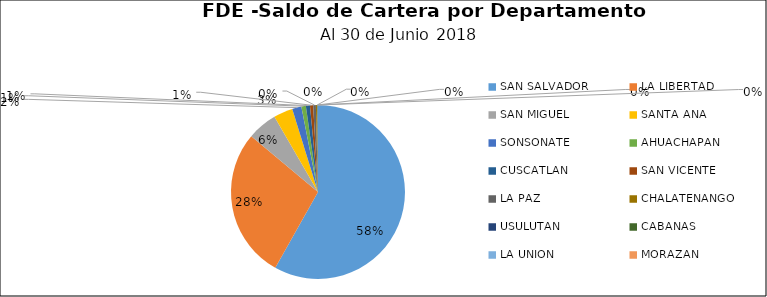
| Category | Saldo | Créditos |
|---|---|---|
| SAN SALVADOR | 29.787 | 396 |
| LA LIBERTAD | 14.299 | 139 |
| SAN MIGUEL | 2.852 | 22 |
| SANTA ANA | 1.823 | 20 |
| SONSONATE | 0.878 | 23 |
| AHUACHAPAN | 0.426 | 11 |
| CUSCATLAN | 0.392 | 29 |
| SAN VICENTE | 0.3 | 4 |
| LA PAZ | 0.255 | 13 |
| CHALATENANGO | 0.101 | 15 |
| USULUTAN | 0.041 | 10 |
| CABAÑAS | 0.04 | 10 |
| LA UNION | 0.016 | 1 |
| MORAZAN | 0.002 | 1 |